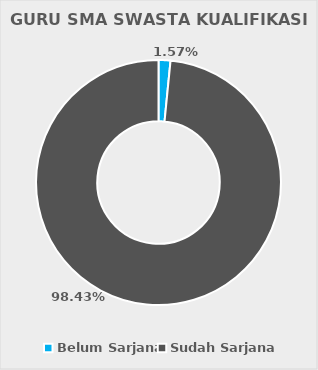
| Category | GURU SMA SWASTA KUALIFIKASI S1 |
|---|---|
| Belum Sarjana | 4 |
| Sudah Sarjana | 251 |